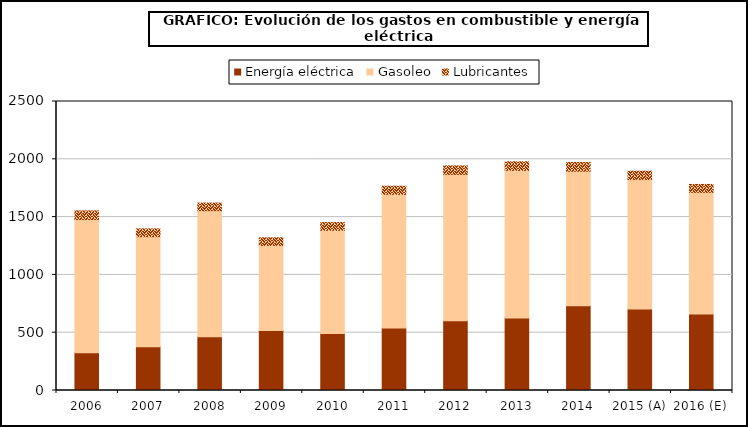
| Category | Energía eléctrica | Gasoleo | Lubricantes |
|---|---|---|---|
| 2006 | 325.85 | 1152.791 | 75.344 |
| 2007 | 379.292 | 951.283 | 67.537 |
| 2008 | 465.509 | 1089.777 | 66.177 |
| 2009 | 519.861 | 735.254 | 65.464 |
| 2010 | 492.737 | 892.822 | 66.957 |
| 2011 | 541.39 | 1155.464 | 70.222 |
| 2012 | 602.887 | 1266.655 | 72.753 |
| 2013 | 628.022 | 1275.795 | 74.642 |
| 2014 | 733.314 | 1163.411 | 75.37 |
| 2015 (A) | 705.431 | 1119.176 | 72.504 |
| 2016 (E) | 662.789 | 1051.523 | 68.121 |